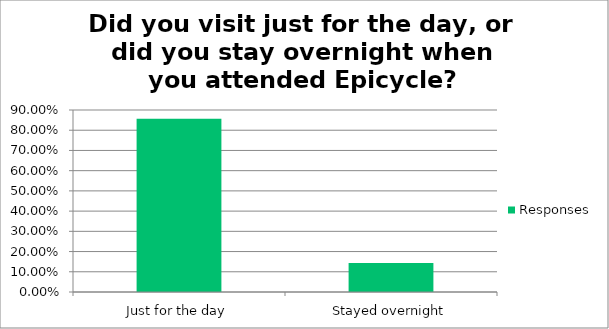
| Category | Responses |
|---|---|
| Just for the day | 0.857 |
| Stayed overnight | 0.143 |